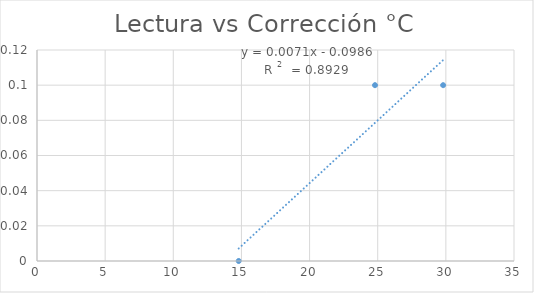
| Category | Series 0 |
|---|---|
| 14.8 | 0 |
| 24.8 | 0.1 |
| 29.8 | 0.1 |